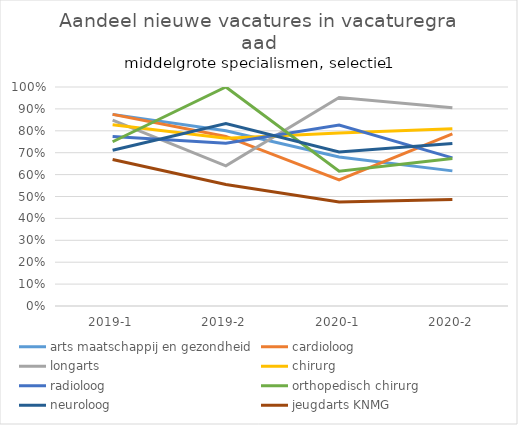
| Category | arts maatschappij en gezondheid | cardioloog | longarts | chirurg | radioloog | orthopedisch chirurg | neuroloog | jeugdarts KNMG |
|---|---|---|---|---|---|---|---|---|
| 2019-1 | 0.875 | 0.875 | 0.848 | 0.828 | 0.774 | 0.75 | 0.711 | 0.669 |
| 2019-2 | 0.8 | 0.774 | 0.64 | 0.766 | 0.744 | 1 | 0.833 | 0.555 |
| 2020-1 | 0.68 | 0.576 | 0.952 | 0.79 | 0.827 | 0.615 | 0.704 | 0.475 |
| 2020-2 | 0.617 | 0.786 | 0.906 | 0.81 | 0.676 | 0.674 | 0.742 | 0.486 |